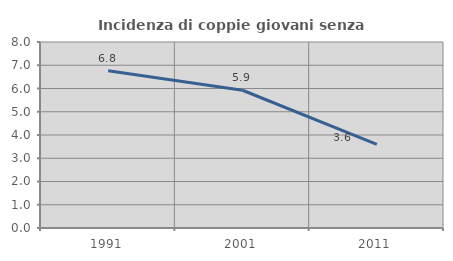
| Category | Incidenza di coppie giovani senza figli |
|---|---|
| 1991.0 | 6.762 |
| 2001.0 | 5.925 |
| 2011.0 | 3.598 |